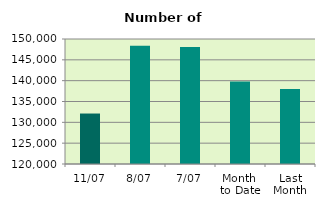
| Category | Series 0 |
|---|---|
| 11/07 | 132114 |
| 8/07 | 148390 |
| 7/07 | 148082 |
| Month 
to Date | 139813.429 |
| Last
Month | 138016.909 |